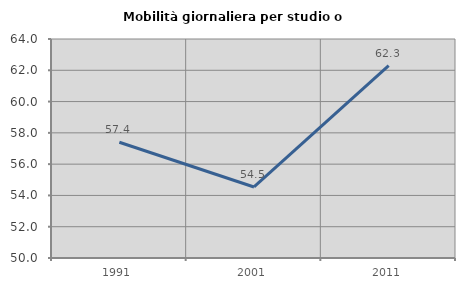
| Category | Mobilità giornaliera per studio o lavoro |
|---|---|
| 1991.0 | 57.402 |
| 2001.0 | 54.54 |
| 2011.0 | 62.304 |